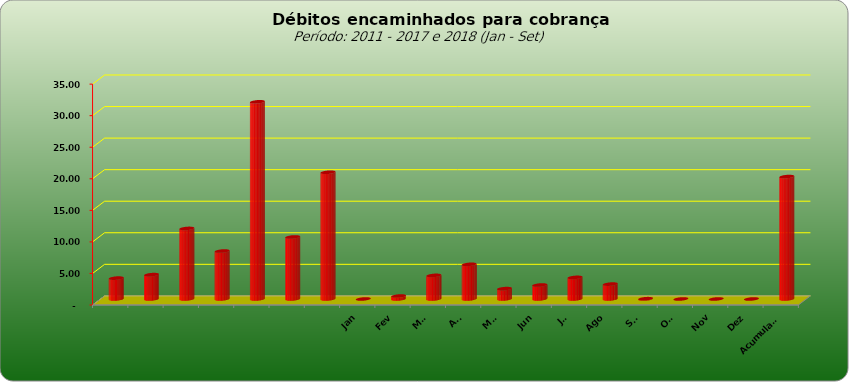
| Category |  3.309.443,02  |
|---|---|
|  | 3309443.02 |
|  | 3859728.44 |
|  | 11181928.25 |
|  | 7600526.01 |
|  | 31248623.5 |
|  | 9830198.34 |
|  | 20083556.95 |
| Jan | 0 |
| Fev | 468831.1 |
| Mar | 3741527.45 |
| Abr | 5493663.59 |
| Mai | 1643658.45 |
| Jun | 2215524.43 |
| Jul | 3425456.07 |
| Ago | 2362409.7 |
| Set | 48910.4 |
| Out | 0 |
| Nov | 0 |
| Dez | 0 |
| Acumulado | 19399981.19 |